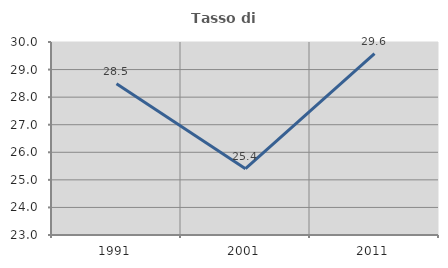
| Category | Tasso di occupazione   |
|---|---|
| 1991.0 | 28.485 |
| 2001.0 | 25.407 |
| 2011.0 | 29.582 |